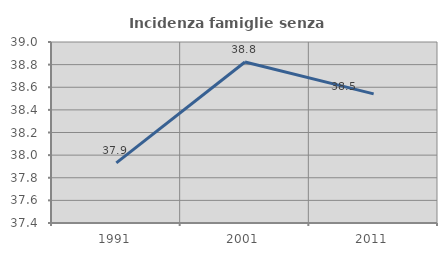
| Category | Incidenza famiglie senza nuclei |
|---|---|
| 1991.0 | 37.931 |
| 2001.0 | 38.824 |
| 2011.0 | 38.542 |